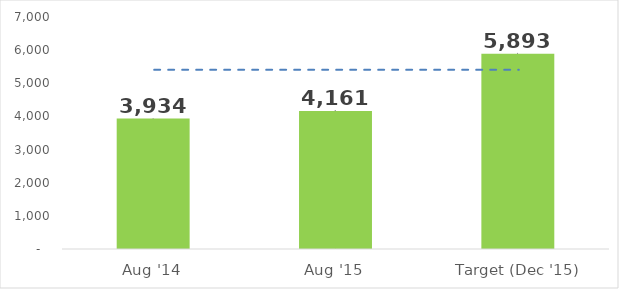
| Category | Series 1 |
|---|---|
| Aug '14 | 3934.188 |
| Aug '15 | 4160.844 |
| Target (Dec '15) | 5893.219 |